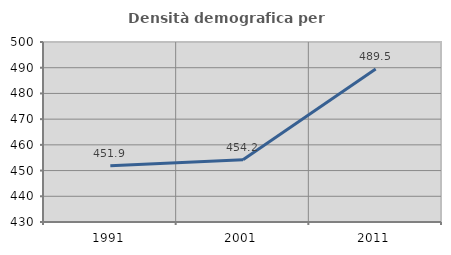
| Category | Densità demografica |
|---|---|
| 1991.0 | 451.918 |
| 2001.0 | 454.248 |
| 2011.0 | 489.481 |